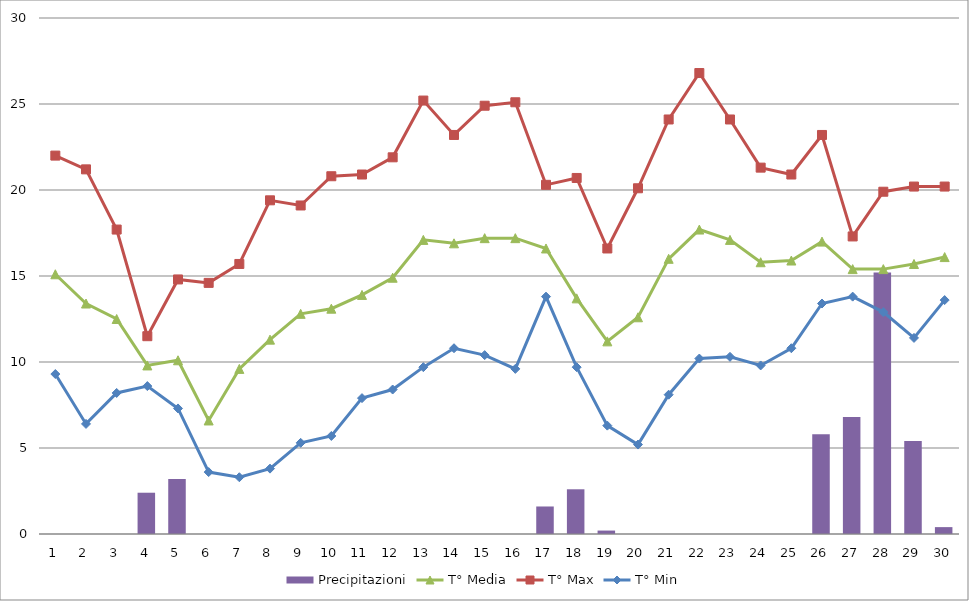
| Category | Precipitazioni |
|---|---|
| 0 | 0 |
| 1 | 0 |
| 2 | 0 |
| 3 | 2.4 |
| 4 | 3.2 |
| 5 | 0 |
| 6 | 0 |
| 7 | 0 |
| 8 | 0 |
| 9 | 0 |
| 10 | 0 |
| 11 | 0 |
| 12 | 0 |
| 13 | 0 |
| 14 | 0 |
| 15 | 0 |
| 16 | 1.6 |
| 17 | 2.6 |
| 18 | 0.2 |
| 19 | 0 |
| 20 | 0 |
| 21 | 0 |
| 22 | 0 |
| 23 | 0 |
| 24 | 0 |
| 25 | 5.8 |
| 26 | 6.8 |
| 27 | 15.2 |
| 28 | 5.4 |
| 29 | 0.4 |